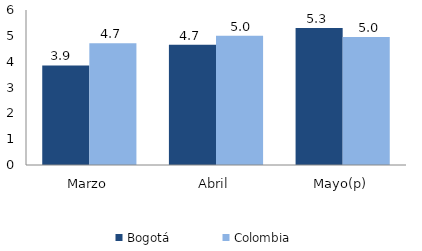
| Category | Bogotá | Colombia |
|---|---|---|
| Marzo | 3.855 | 4.711 |
| Abril | 4.659 | 5.001 |
| Mayo(p) | 5.308 | 4.954 |